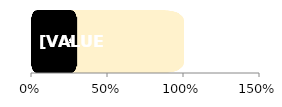
| Category | Total | Female |
|---|---|---|
| 0 | 1 | 0.297 |